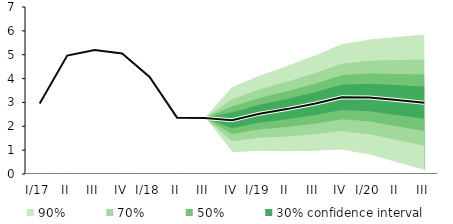
| Category | linka | Střed předpovědi |
|---|---|---|
| I/17 | 2.952 | 2.952 |
| II | 4.963 | 4.963 |
| III | 5.197 | 5.197 |
| IV | 5.048 | 5.048 |
| I/18 | 4.071 | 4.071 |
| II | 2.362 | 2.362 |
| III | 2.352 | 2.352 |
| IV | 2.253 | 2.253 |
| I/19 | 2.529 | 2.529 |
| II | 2.72 | 2.72 |
| III | 2.946 | 2.946 |
| IV | 3.213 | 3.213 |
| I/20 | 3.206 | 3.206 |
| II | 3.098 | 3.098 |
| III | 2.991 | 2.991 |